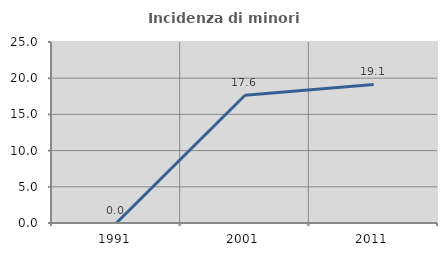
| Category | Incidenza di minori stranieri |
|---|---|
| 1991.0 | 0 |
| 2001.0 | 17.647 |
| 2011.0 | 19.13 |